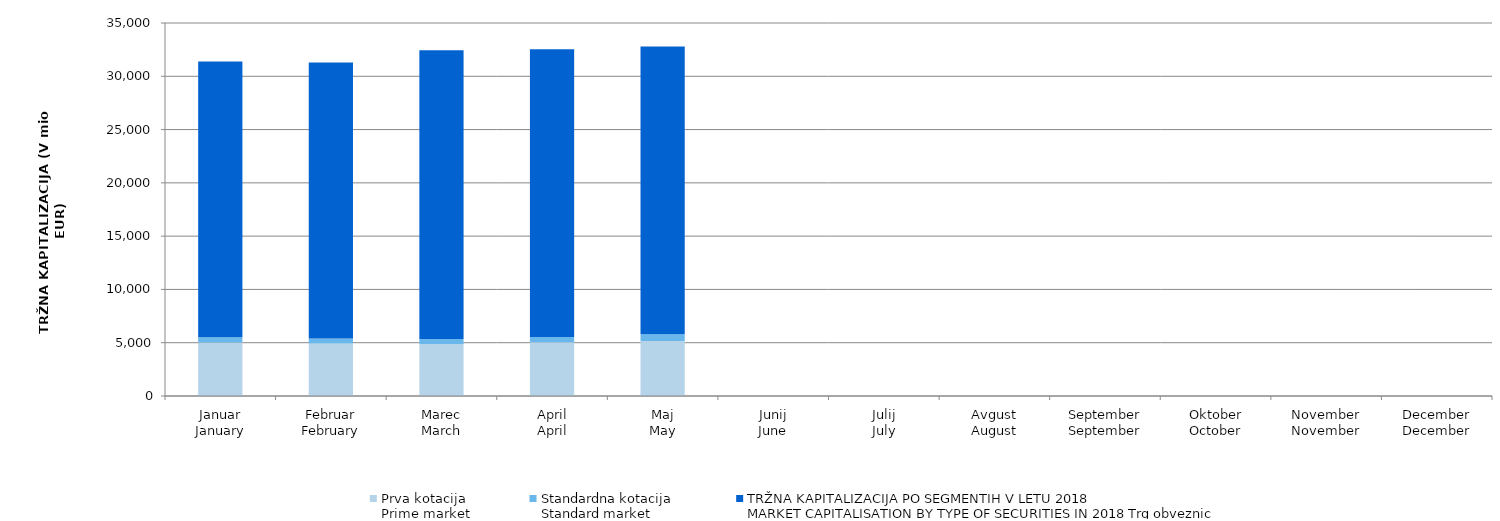
| Category | Prva kotacija
Prime market | Standardna kotacija
Standard market | Series 3 |
|---|---|---|---|
| Januar
January | 5022.792 | 483.67 | 25885.901 |
| Februar
February | 4922.405 | 471.165 | 25899.375 |
| Marec
March | 4884.025 | 463.212 | 27099.633 |
| April
April | 5038.448 | 492.653 | 27015.924 |
| Maj
May | 5153.368 | 630.304 | 27015.655 |
| Junij
June | 0 | 0 | 0 |
| Julij
July | 0 | 0 | 0 |
| Avgust
August | 0 | 0 | 0 |
| September
September | 0 | 0 | 0 |
| Oktober
October | 0 | 0 | 0 |
| November
November | 0 | 0 | 0 |
| December
December | 0 | 0 | 0 |